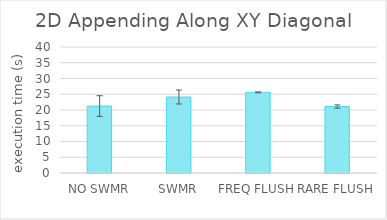
| Category | 2D Appending Along XY Diagonal |
|---|---|
| NO SWMR | 21.253 |
| SWMR | 24.121 |
| FREQ FLUSH | 25.592 |
| RARE FLUSH | 21.101 |